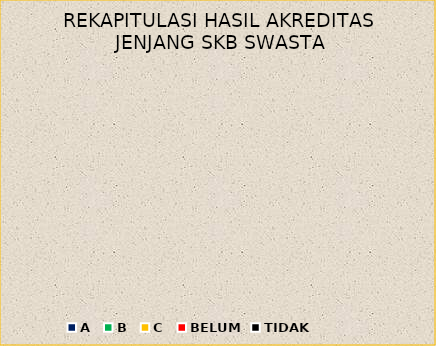
| Category | REKAPITULASI HASIL AKREDITASI JENJANG SKB SWASTA |
|---|---|
| A | 0 |
| B | 0 |
| C | 0 |
| BELUM | 0 |
| TIDAK | 0 |